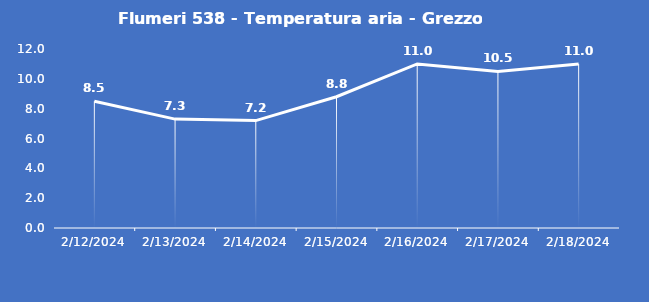
| Category | Flumeri 538 - Temperatura aria - Grezzo (°C) |
|---|---|
| 2/12/24 | 8.5 |
| 2/13/24 | 7.3 |
| 2/14/24 | 7.2 |
| 2/15/24 | 8.8 |
| 2/16/24 | 11 |
| 2/17/24 | 10.5 |
| 2/18/24 | 11 |